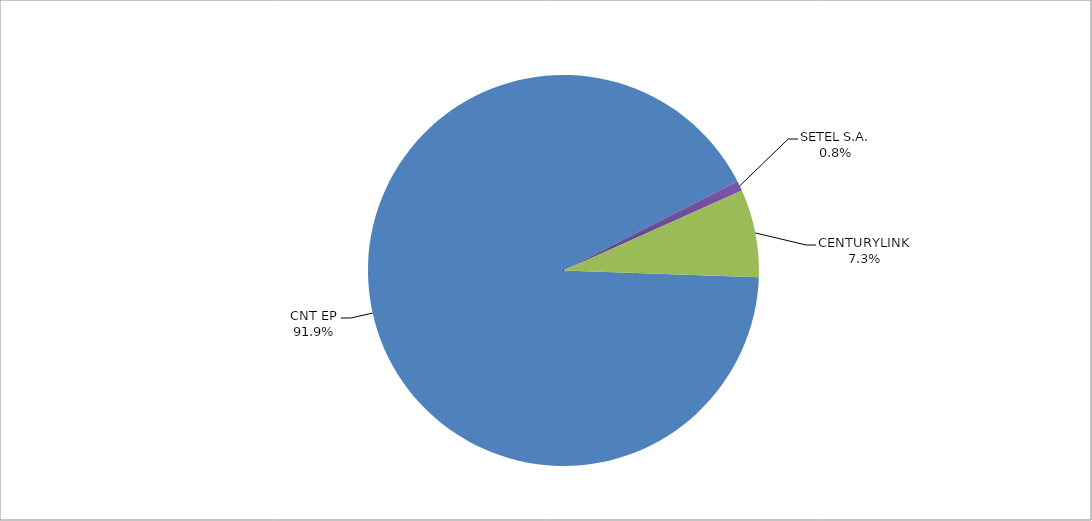
| Category | Series 0 |
|---|---|
| CNT EP | 329 |
| SETEL S.A. | 3 |
| CENTURYLINK | 26 |